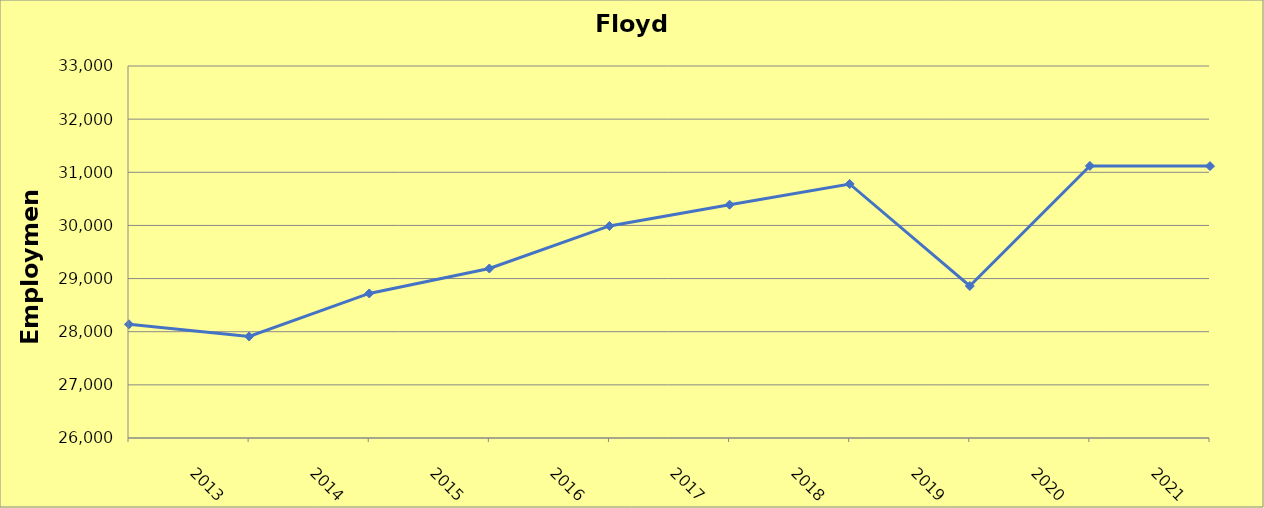
| Category | Floyd County |
|---|---|
| 2013.0 | 28140 |
| 2014.0 | 27910 |
| 2015.0 | 28720 |
| 2016.0 | 29190 |
| 2017.0 | 29990 |
| 2018.0 | 30390 |
| 2019.0 | 30780 |
| 2020.0 | 28860 |
| 2021.0 | 31120 |
| 2022.0 | 31116 |